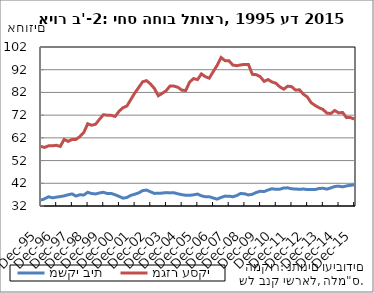
| Category | משקי בית | מגזר עסקי |
|---|---|---|
| 1995-12-31 | 34.552 | 58.246 |
| 1996-03-31 | 35.16 | 57.778 |
| 1996-06-30 | 36.078 | 58.502 |
| 1996-09-30 | 35.596 | 58.512 |
| 1996-12-31 | 35.889 | 58.732 |
| 1997-03-31 | 36.153 | 58.221 |
| 1997-06-30 | 36.463 | 61.351 |
| 1997-09-30 | 36.942 | 60.457 |
| 1997-12-31 | 37.324 | 61.328 |
| 1998-03-31 | 36.376 | 61.302 |
| 1998-06-30 | 36.959 | 62.585 |
| 1998-09-30 | 36.832 | 64.371 |
| 1998-12-31 | 38.037 | 68.208 |
| 1999-03-31 | 37.49 | 67.542 |
| 1999-06-30 | 37.303 | 67.98 |
| 1999-09-30 | 37.74 | 70.154 |
| 1999-12-31 | 38.03 | 72.181 |
| 2000-03-31 | 37.467 | 71.963 |
| 2000-06-30 | 37.511 | 71.909 |
| 2000-09-30 | 36.929 | 71.435 |
| 2000-12-31 | 36.248 | 73.728 |
| 2001-03-31 | 35.447 | 75.273 |
| 2001-06-30 | 35.758 | 76.027 |
| 2001-09-30 | 36.692 | 78.886 |
| 2001-12-31 | 37.184 | 81.725 |
| 2002-03-31 | 37.773 | 84.143 |
| 2002-06-30 | 38.767 | 86.682 |
| 2002-09-30 | 39.018 | 87.19 |
| 2002-12-31 | 38.271 | 85.724 |
| 2003-03-31 | 37.542 | 83.756 |
| 2003-06-30 | 37.6 | 80.531 |
| 2003-09-30 | 37.684 | 81.572 |
| 2003-12-31 | 37.902 | 82.755 |
| 2004-03-31 | 37.772 | 84.826 |
| 2004-06-30 | 37.817 | 84.775 |
| 2004-09-30 | 37.355 | 84.267 |
| 2004-12-31 | 36.997 | 83.001 |
| 2005-03-31 | 36.714 | 82.857 |
| 2005-06-30 | 36.699 | 86.573 |
| 2005-09-30 | 36.919 | 88.103 |
| 2005-12-31 | 37.259 | 87.64 |
| 2006-03-31 | 36.482 | 90.162 |
| 2006-06-30 | 36.086 | 88.947 |
| 2006-09-30 | 36.091 | 88.267 |
| 2006-12-31 | 35.532 | 91.126 |
| 2007-03-31 | 35.031 | 93.907 |
| 2007-06-30 | 35.757 | 97.392 |
| 2007-09-30 | 36.349 | 95.988 |
| 2007-12-31 | 36.336 | 95.973 |
| 2008-03-31 | 36.077 | 94.07 |
| 2008-06-30 | 36.603 | 93.767 |
| 2008-09-30 | 37.503 | 94.097 |
| 2008-12-31 | 37.377 | 94.349 |
| 2009-03-31 | 36.856 | 94.268 |
| 2009-06-30 | 37.168 | 89.967 |
| 2009-09-30 | 37.987 | 89.807 |
| 2009-12-31 | 38.474 | 88.923 |
| 2010-03-31 | 38.369 | 86.858 |
| 2010-06-30 | 39.06 | 87.664 |
| 2010-09-30 | 39.597 | 86.594 |
| 2010-12-31 | 39.349 | 86.043 |
| 2011-03-31 | 39.402 | 84.431 |
| 2011-06-30 | 39.926 | 83.432 |
| 2011-09-30 | 39.994 | 84.757 |
| 2011-12-31 | 39.575 | 84.547 |
| 2012-03-31 | 39.481 | 83.039 |
| 2012-06-30 | 39.335 | 83.162 |
| 2012-09-30 | 39.473 | 81.243 |
| 2012-12-31 | 39.227 | 80.003 |
| 2013-03-31 | 39.231 | 77.467 |
| 2013-06-30 | 39.242 | 76.258 |
| 2013-09-30 | 39.718 | 75.266 |
| 2013-12-31 | 39.803 | 74.508 |
| 2014-03-31 | 39.429 | 72.887 |
| 2014-06-30 | 39.966 | 72.709 |
| 2014-09-30 | 40.593 | 74.042 |
| 2014-12-31 | 40.732 | 72.992 |
| 2015-03-31 | 40.435 | 73.175 |
| 2015-06-30 | 40.831 | 70.906 |
| 2015-09-30 | 41.135 | 70.926 |
| 2015-12-31 | 41.289 | 70.277 |